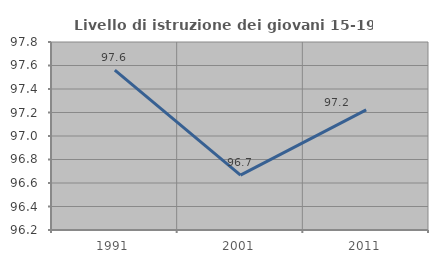
| Category | Livello di istruzione dei giovani 15-19 anni |
|---|---|
| 1991.0 | 97.561 |
| 2001.0 | 96.667 |
| 2011.0 | 97.222 |